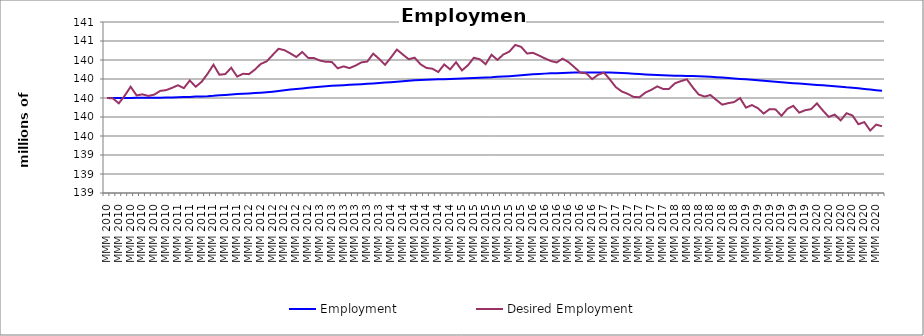
| Category | Employment | Desired Employment |
|---|---|---|
| MMM 2010 | 140 | 140 |
| MMM 2010 | 140 | 139.996 |
| MMM 2010 | 140 | 139.944 |
| MMM 2010 | 139.999 | 140.024 |
| MMM 2010 | 139.999 | 140.119 |
| MMM 2010 | 140.001 | 140.028 |
| MMM 2010 | 140.002 | 140.038 |
| MMM 2010 | 140.003 | 140.022 |
| MMM 2010 | 140.003 | 140.036 |
| MMM 2010 | 140.003 | 140.075 |
| MMM 2010 | 140.005 | 140.083 |
| MMM 2010 | 140.006 | 140.107 |
| MMM 2011 | 140.008 | 140.134 |
| MMM 2011 | 140.01 | 140.104 |
| MMM 2011 | 140.012 | 140.185 |
| MMM 2011 | 140.015 | 140.118 |
| MMM 2011 | 140.016 | 140.171 |
| MMM 2011 | 140.019 | 140.254 |
| MMM 2011 | 140.023 | 140.35 |
| MMM 2011 | 140.029 | 140.245 |
| MMM 2011 | 140.033 | 140.252 |
| MMM 2011 | 140.036 | 140.319 |
| MMM 2011 | 140.041 | 140.226 |
| MMM 2011 | 140.045 | 140.255 |
| MMM 2012 | 140.048 | 140.251 |
| MMM 2012 | 140.052 | 140.299 |
| MMM 2012 | 140.056 | 140.359 |
| MMM 2012 | 140.061 | 140.386 |
| MMM 2012 | 140.067 | 140.453 |
| MMM 2012 | 140.074 | 140.518 |
| MMM 2012 | 140.081 | 140.504 |
| MMM 2012 | 140.089 | 140.469 |
| MMM 2012 | 140.095 | 140.432 |
| MMM 2012 | 140.101 | 140.484 |
| MMM 2012 | 140.108 | 140.422 |
| MMM 2012 | 140.113 | 140.42 |
| MMM 2013 | 140.119 | 140.394 |
| MMM 2013 | 140.123 | 140.381 |
| MMM 2013 | 140.128 | 140.38 |
| MMM 2013 | 140.132 | 140.313 |
| MMM 2013 | 140.135 | 140.333 |
| MMM 2013 | 140.139 | 140.314 |
| MMM 2013 | 140.142 | 140.341 |
| MMM 2013 | 140.145 | 140.375 |
| MMM 2013 | 140.149 | 140.384 |
| MMM 2013 | 140.153 | 140.467 |
| MMM 2013 | 140.159 | 140.412 |
| MMM 2013 | 140.163 | 140.349 |
| MMM 2014 | 140.166 | 140.427 |
| MMM 2014 | 140.171 | 140.51 |
| MMM 2014 | 140.177 | 140.458 |
| MMM 2014 | 140.182 | 140.408 |
| MMM 2014 | 140.186 | 140.425 |
| MMM 2014 | 140.19 | 140.355 |
| MMM 2014 | 140.193 | 140.316 |
| MMM 2014 | 140.195 | 140.308 |
| MMM 2014 | 140.197 | 140.274 |
| MMM 2014 | 140.198 | 140.353 |
| MMM 2014 | 140.201 | 140.302 |
| MMM 2014 | 140.202 | 140.376 |
| MMM 2015 | 140.206 | 140.291 |
| MMM 2015 | 140.207 | 140.344 |
| MMM 2015 | 140.209 | 140.423 |
| MMM 2015 | 140.213 | 140.408 |
| MMM 2015 | 140.216 | 140.356 |
| MMM 2015 | 140.219 | 140.455 |
| MMM 2015 | 140.223 | 140.401 |
| MMM 2015 | 140.226 | 140.458 |
| MMM 2015 | 140.23 | 140.488 |
| MMM 2015 | 140.235 | 140.558 |
| MMM 2015 | 140.24 | 140.538 |
| MMM 2015 | 140.245 | 140.468 |
| MMM 2016 | 140.249 | 140.476 |
| MMM 2016 | 140.253 | 140.448 |
| MMM 2016 | 140.257 | 140.417 |
| MMM 2016 | 140.259 | 140.39 |
| MMM 2016 | 140.262 | 140.374 |
| MMM 2016 | 140.264 | 140.414 |
| MMM 2016 | 140.266 | 140.378 |
| MMM 2016 | 140.268 | 140.325 |
| MMM 2016 | 140.269 | 140.267 |
| MMM 2016 | 140.269 | 140.26 |
| MMM 2016 | 140.269 | 140.199 |
| MMM 2016 | 140.268 | 140.244 |
| MMM 2017 | 140.267 | 140.267 |
| MMM 2017 | 140.267 | 140.195 |
| MMM 2017 | 140.266 | 140.115 |
| MMM 2017 | 140.263 | 140.069 |
| MMM 2017 | 140.26 | 140.044 |
| MMM 2017 | 140.256 | 140.012 |
| MMM 2017 | 140.252 | 140.008 |
| MMM 2017 | 140.248 | 140.057 |
| MMM 2017 | 140.244 | 140.086 |
| MMM 2017 | 140.242 | 140.122 |
| MMM 2017 | 140.24 | 140.095 |
| MMM 2017 | 140.237 | 140.096 |
| MMM 2018 | 140.235 | 140.155 |
| MMM 2018 | 140.233 | 140.177 |
| MMM 2018 | 140.232 | 140.197 |
| MMM 2018 | 140.232 | 140.113 |
| MMM 2018 | 140.23 | 140.037 |
| MMM 2018 | 140.226 | 140.015 |
| MMM 2018 | 140.223 | 140.031 |
| MMM 2018 | 140.219 | 139.979 |
| MMM 2018 | 140.215 | 139.93 |
| MMM 2018 | 140.21 | 139.946 |
| MMM 2018 | 140.206 | 139.957 |
| MMM 2018 | 140.201 | 139.999 |
| MMM 2019 | 140.198 | 139.899 |
| MMM 2019 | 140.193 | 139.925 |
| MMM 2019 | 140.188 | 139.893 |
| MMM 2019 | 140.183 | 139.837 |
| MMM 2019 | 140.177 | 139.883 |
| MMM 2019 | 140.172 | 139.88 |
| MMM 2019 | 140.167 | 139.813 |
| MMM 2019 | 140.161 | 139.886 |
| MMM 2019 | 140.156 | 139.917 |
| MMM 2019 | 140.152 | 139.846 |
| MMM 2019 | 140.146 | 139.871 |
| MMM 2019 | 140.142 | 139.883 |
| MMM 2020 | 140.137 | 139.943 |
| MMM 2020 | 140.134 | 139.868 |
| MMM 2020 | 140.129 | 139.801 |
| MMM 2020 | 140.123 | 139.825 |
| MMM 2020 | 140.118 | 139.764 |
| MMM 2020 | 140.112 | 139.84 |
| MMM 2020 | 140.107 | 139.816 |
| MMM 2020 | 140.102 | 139.724 |
| MMM 2020 | 140.096 | 139.746 |
| MMM 2020 | 140.09 | 139.658 |
| MMM 2020 | 140.082 | 139.72 |
| MMM 2020 | 140.076 | 139.703 |